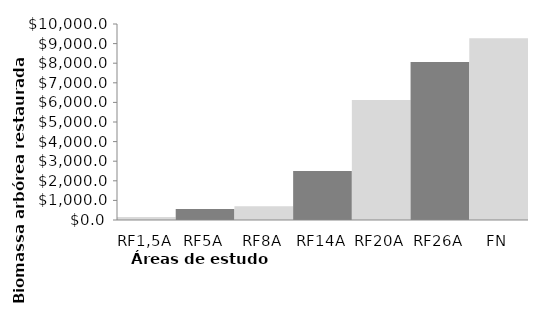
| Category | Series 0 |
|---|---|
| RF1,5A | 153.468 |
| RF5A | 557.203 |
| RF8A | 696.633 |
| RF14A | 2496.303 |
| RF20A | 6119.399 |
| RF26A | 8065.81 |
| FN | 9275.094 |